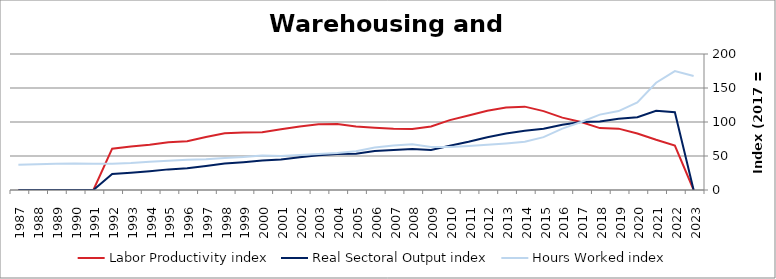
| Category | Labor Productivity index | Real Sectoral Output index | Hours Worked index |
|---|---|---|---|
| 2023.0 | 0 | 0 | 167.717 |
| 2022.0 | 65.382 | 114.328 | 174.861 |
| 2021.0 | 73.817 | 116.427 | 157.724 |
| 2020.0 | 83.097 | 107.065 | 128.843 |
| 2019.0 | 90.228 | 104.721 | 116.063 |
| 2018.0 | 91.007 | 100.905 | 110.877 |
| 2017.0 | 100 | 100 | 100 |
| 2016.0 | 106.439 | 96.057 | 90.246 |
| 2015.0 | 115.981 | 90.182 | 77.755 |
| 2014.0 | 122.585 | 86.978 | 70.954 |
| 2013.0 | 121.221 | 83.031 | 68.495 |
| 2012.0 | 116.641 | 77.573 | 66.506 |
| 2011.0 | 109.609 | 70.923 | 64.705 |
| 2010.0 | 102.728 | 64.924 | 63.2 |
| 2009.0 | 93.303 | 58.85 | 63.075 |
| 2008.0 | 89.728 | 60.316 | 67.221 |
| 2007.0 | 89.896 | 58.975 | 65.604 |
| 2006.0 | 91.529 | 57.239 | 62.536 |
| 2005.0 | 93.329 | 53.231 | 57.036 |
| 2004.0 | 96.913 | 52.783 | 54.465 |
| 2003.0 | 96.543 | 51.074 | 52.903 |
| 2002.0 | 93.368 | 48.144 | 51.564 |
| 2001.0 | 89.313 | 44.737 | 50.09 |
| 2000.0 | 84.947 | 43.241 | 50.904 |
| 1999.0 | 84.603 | 40.953 | 48.406 |
| 1998.0 | 83.332 | 39.106 | 46.927 |
| 1997.0 | 78.083 | 35.401 | 45.338 |
| 1996.0 | 71.816 | 31.861 | 44.365 |
| 1995.0 | 70.237 | 30.326 | 43.177 |
| 1994.0 | 66.418 | 27.589 | 41.539 |
| 1993.0 | 64.088 | 25.368 | 39.583 |
| 1992.0 | 60.772 | 23.568 | 38.781 |
| 1991.0 | 0 | 0 | 38.542 |
| 1990.0 | 0 | 0 | 39.006 |
| 1989.0 | 0 | 0 | 38.778 |
| 1988.0 | 0 | 0 | 37.872 |
| 1987.0 | 0 | 0 | 37.238 |